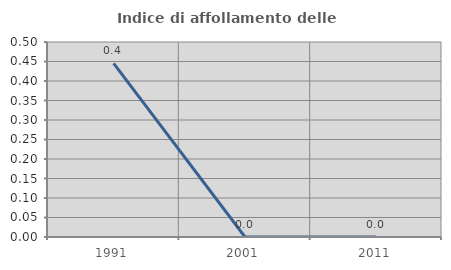
| Category | Indice di affollamento delle abitazioni  |
|---|---|
| 1991.0 | 0.445 |
| 2001.0 | 0 |
| 2011.0 | 0 |